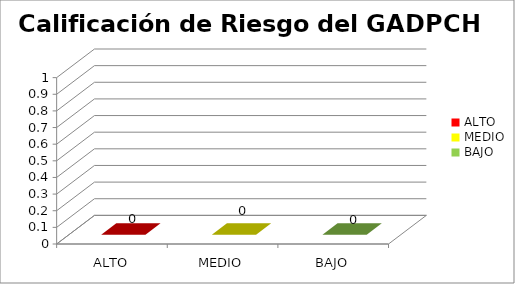
| Category | Calificación de Riesgo del GADPCH |
|---|---|
| ALTO | 0 |
| MEDIO | 0 |
| BAJO | 0 |